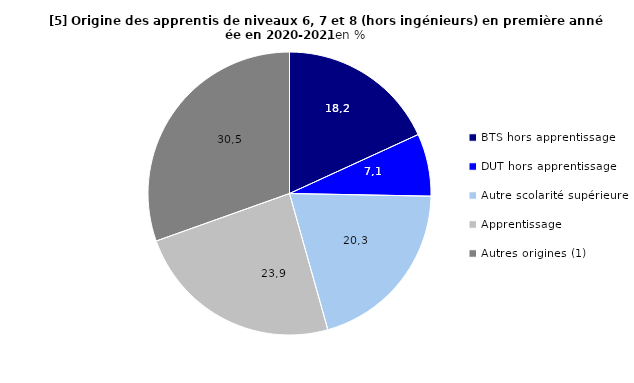
| Category | Series 0 | Series 1 |
|---|---|---|
| BTS hors apprentissage | 18.16 |  |
| DUT hors apprentissage | 7.14 |  |
| Autre scolarité supérieure | 20.33 |  |
| Apprentissage | 23.92 |  |
| Autres origines (1) | 30.45 |  |